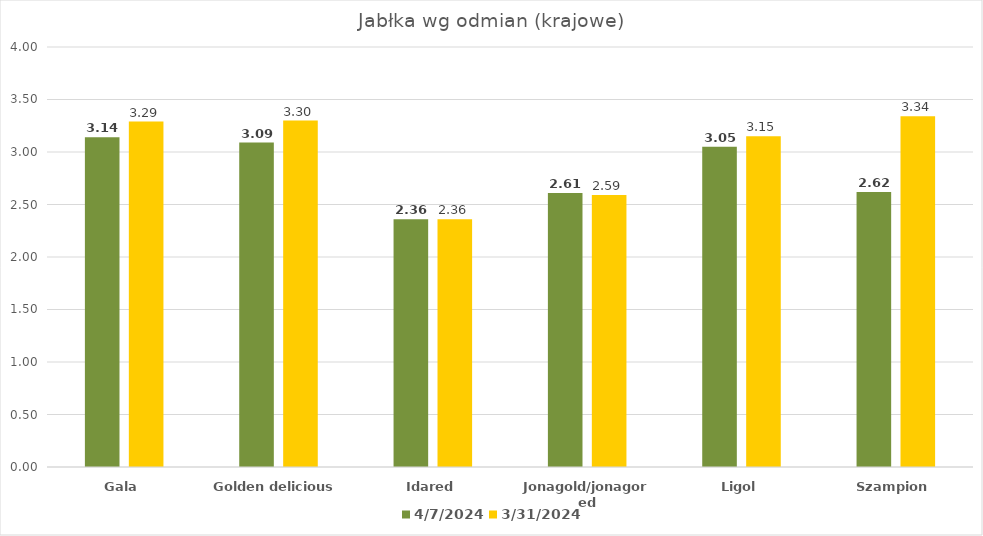
| Category | 2024-04-07 | 2024-03-31 |
|---|---|---|
| Gala | 3.14 | 3.29 |
| Golden delicious | 3.09 | 3.3 |
| Idared | 2.36 | 2.36 |
| Jonagold/jonagored | 2.61 | 2.59 |
| Ligol | 3.05 | 3.15 |
| Szampion | 2.62 | 3.34 |